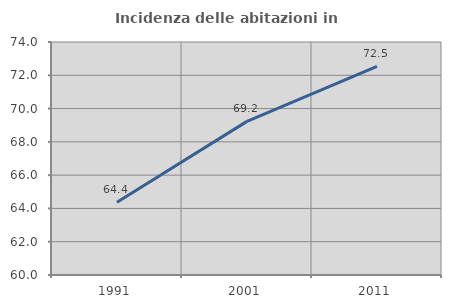
| Category | Incidenza delle abitazioni in proprietà  |
|---|---|
| 1991.0 | 64.365 |
| 2001.0 | 69.231 |
| 2011.0 | 72.532 |